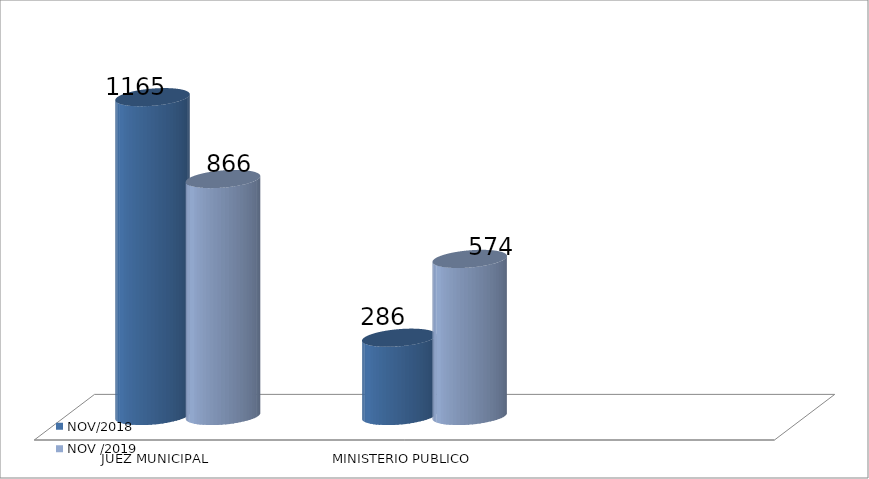
| Category | NOV/2018 | NOV /2019 |
|---|---|---|
| JUEZ MUNICIPAL | 1165 | 866 |
| MINISTERIO PUBLICO | 286 | 574 |